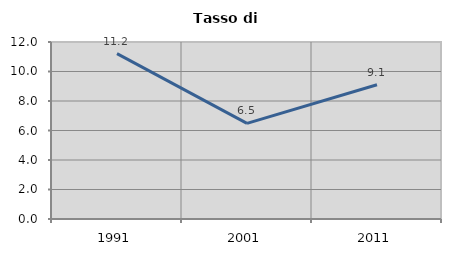
| Category | Tasso di disoccupazione   |
|---|---|
| 1991.0 | 11.213 |
| 2001.0 | 6.485 |
| 2011.0 | 9.102 |